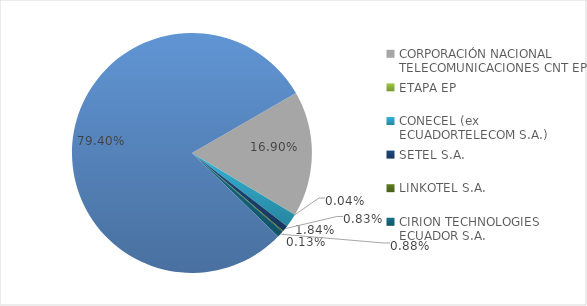
| Category | CODIGO DE AREA 2 |
|---|---|
| CORPORACIÓN NACIONAL TELECOMUNICACIONES CNT EP | 0.169 |
| ETAPA EP | 0 |
| CONECEL (ex ECUADORTELECOM S.A.) | 0.018 |
| SETEL S.A. | 0.008 |
| LINKOTEL S.A. | 0.001 |
| CIRION TECHNOLOGIES ECUADOR S.A. | 0.009 |
| DISPONIBLE | 0.794 |